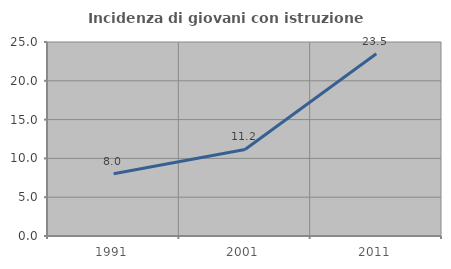
| Category | Incidenza di giovani con istruzione universitaria |
|---|---|
| 1991.0 | 8.031 |
| 2001.0 | 11.152 |
| 2011.0 | 23.478 |